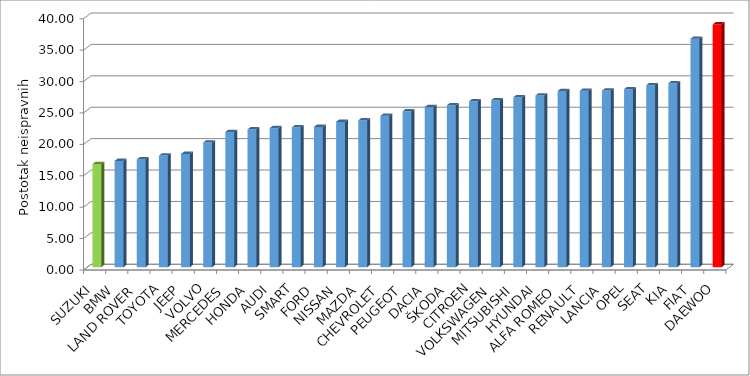
| Category | Series 4 |
|---|---|
| SUZUKI | 16.407 |
| BMW | 16.917 |
| LAND ROVER | 17.15 |
| TOYOTA | 17.764 |
| JEEP | 18.03 |
| VOLVO | 19.853 |
| MERCEDES | 21.521 |
| HONDA | 21.936 |
| AUDI | 22.129 |
| SMART | 22.258 |
| FORD | 22.33 |
| NISSAN | 23.125 |
| MAZDA | 23.361 |
| CHEVROLET | 24.088 |
| PEUGEOT | 24.818 |
| DACIA | 25.471 |
| ŠKODA | 25.775 |
| CITROEN | 26.408 |
| VOLKSWAGEN | 26.577 |
| MITSUBISHI | 27.053 |
| HYUNDAI | 27.329 |
| ALFA ROMEO | 28.037 |
| RENAULT | 28.077 |
| LANCIA | 28.103 |
| OPEL | 28.331 |
| SEAT | 28.955 |
| KIA | 29.283 |
| FIAT | 36.364 |
| DAEWOO | 38.641 |